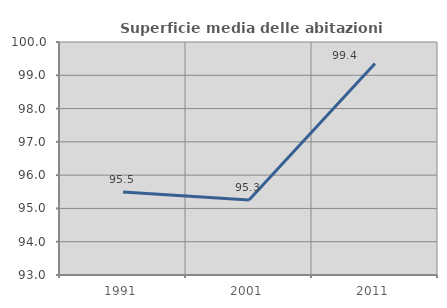
| Category | Superficie media delle abitazioni occupate |
|---|---|
| 1991.0 | 95.493 |
| 2001.0 | 95.255 |
| 2011.0 | 99.355 |